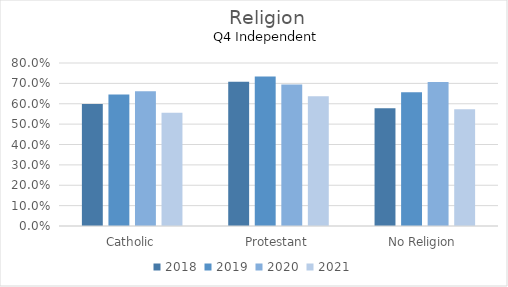
| Category | 2018 | 2019 | 2020 | 2021 |
|---|---|---|---|---|
| Catholic | 0.599 | 0.645 | 0.661 | 0.556 |
| Protestant | 0.708 | 0.734 | 0.694 | 0.637 |
| No Religion | 0.578 | 0.656 | 0.707 | 0.572 |